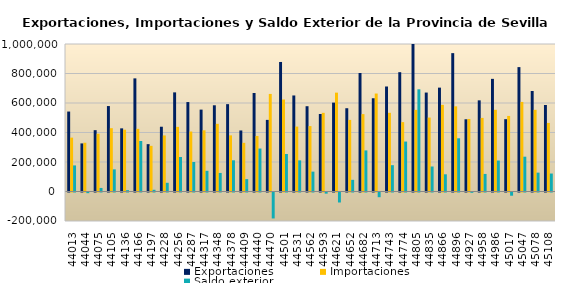
| Category | Exportaciones | Importaciones | Saldo exterior |
|---|---|---|---|
| 2020-07-01 | 542062.84 | 365220.14 | 176842.7 |
| 2020-08-01 | 326019.87 | 330571.15 | -4551.28 |
| 2020-09-01 | 415851.9 | 391765.11 | 24086.79 |
| 2020-10-01 | 579330.62 | 429257.84 | 150072.78 |
| 2020-11-01 | 428116.983 | 418885.529 | 9231.454 |
| 2020-12-01 | 766984.753 | 424753.82 | 342230.933 |
| 2021-01-01 | 321034.51 | 309401.55 | 11632.96 |
| 2021-02-01 | 439118.25 | 380078.53 | 59039.72 |
| 2021-03-01 | 672033.91 | 438109.5 | 233924.41 |
| 2021-04-01 | 606425.01 | 406580.73 | 199844.28 |
| 2021-05-01 | 555191.59 | 414958.96 | 140232.63 |
| 2021-06-01 | 584517.86 | 458749.69 | 125768.17 |
| 2021-07-01 | 592215.46 | 380627.08 | 211588.38 |
| 2021-08-01 | 413833.07 | 329895.94 | 83937.13 |
| 2021-09-01 | 667860.28 | 376602.79 | 291257.49 |
| 2021-10-01 | 485511.53 | 661520.46 | -176008.93 |
| 2021-11-01 | 878182.96 | 623772.34 | 254410.62 |
| 2021-12-01 | 651099.404 | 440022.513 | 211076.891 |
| 2022-01-01 | 578231.872 | 443547.062 | 134684.81 |
| 2022-02-01 | 525546.083 | 533306.789 | -7760.706 |
| 2022-03-01 | 602474.187 | 670231.521 | -67757.334 |
| 2022-04-01 | 564566.111 | 485418.348 | 79147.763 |
| 2022-05-01 | 803329.469 | 524697.141 | 278632.328 |
| 2022-06-01 | 632182.316 | 664140.82 | -31958.504 |
| 2022-07-01 | 711919.091 | 533469.032 | 178450.06 |
| 2022-08-01 | 808936.658 | 470305.866 | 338630.792 |
| 2022-09-01 | 1246269.653 | 553362.196 | 692907.456 |
| 2022-10-01 | 670788.005 | 501262.217 | 169525.788 |
| 2022-11-01 | 704215.36 | 587583.902 | 116631.458 |
| 2022-12-01 | 938097.978 | 577341.702 | 360756.275 |
| 2023-01-01 | 489684.135 | 491778.698 | -2094.564 |
| 2023-02-01 | 618021.806 | 498976.336 | 119045.469 |
| 2023-03-01 | 763721.131 | 553855.733 | 209865.398 |
| 2023-04-01 | 490467.833 | 512326.009 | -21858.176 |
| 2023-05-01 | 843311.598 | 607316.839 | 235994.759 |
| 2023-06-01 | 681562.258 | 553686.761 | 127875.497 |
| 2023-07-01 | 586592.508 | 464822.429 | 121770.078 |